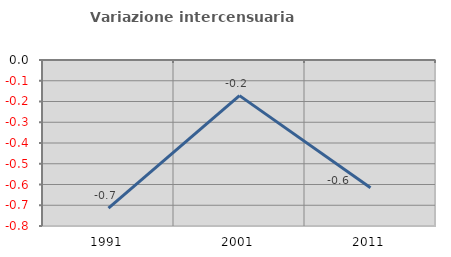
| Category | Variazione intercensuaria annua |
|---|---|
| 1991.0 | -0.714 |
| 2001.0 | -0.172 |
| 2011.0 | -0.615 |